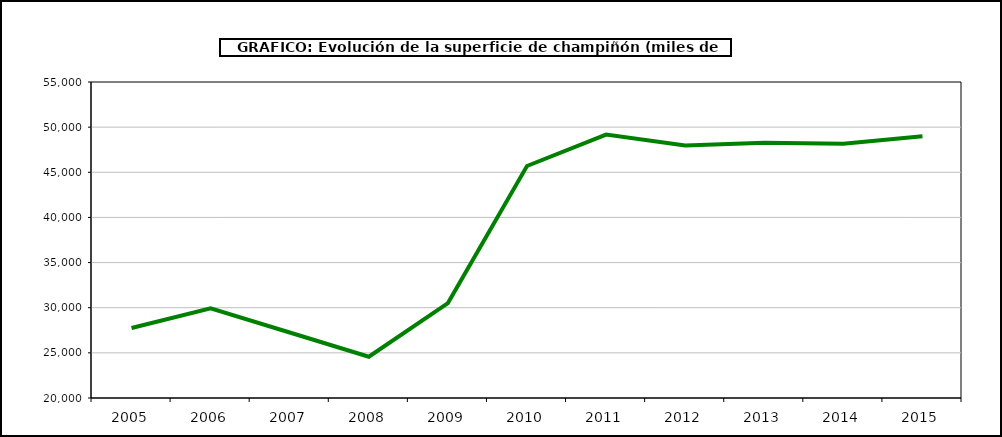
| Category | superficie |
|---|---|
| 2005.0 | 27747 |
| 2006.0 | 29928 |
| 2007.0 | 27253 |
| 2008.0 | 24567 |
| 2009.0 | 30509 |
| 2010.0 | 45697 |
| 2011.0 | 49173 |
| 2012.0 | 47970 |
| 2013.0 | 48261 |
| 2014.0 | 48171 |
| 2015.0 | 48998 |